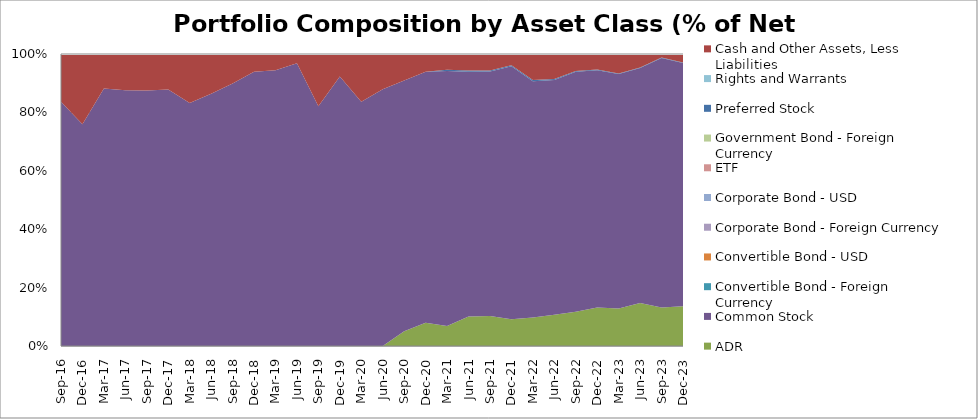
| Category | ADR | Common Stock | Convertible Bond - Foreign Currency  | Convertible Bond - USD | Corporate Bond - Foreign Currency  | Corporate Bond - USD | ETF | Government Bond - Foreign Currency  | Preferred Stock | Rights and Warrants | Cash and Other Assets, Less Liabilities |
|---|---|---|---|---|---|---|---|---|---|---|---|
| 2016-09-30 | 0 | 83.66 | 0 | 0 | 0 | 0 | 0 | 0 | 0 | 0 | 16.34 |
| 2016-12-31 | 0 | 75.91 | 0 | 0 | 0 | 0 | 0 | 0 | 0 | 0 | 24.09 |
| 2017-03-31 | 0 | 88.198 | 0 | 0 | 0 | 0 | 0 | 0 | 0 | 0 | 11.79 |
| 2017-06-30 | 0 | 87.565 | 0 | 0 | 0 | 0 | 0 | 0 | 0 | 0 | 12.434 |
| 2017-09-30 | 0 | 87.49 | 0 | 0 | 0 | 0 | 0 | 0 | 0 | 0 | 12.51 |
| 2017-12-31 | 0 | 87.87 | 0 | 0 | 0 | 0 | 0 | 0 | 0 | 0 | 12.13 |
| 2018-03-31 | 0 | 83.25 | 0 | 0 | 0 | 0 | 0 | 0 | 0 | 0 | 16.75 |
| 2018-06-30 | 0 | 86.4 | 0 | 0 | 0 | 0 | 0 | 0 | 0 | 0 | 13.6 |
| 2018-09-30 | 0 | 89.92 | 0 | 0 | 0 | 0 | 0 | 0 | 0 | 0 | 10.08 |
| 2018-12-31 | 0 | 93.96 | 0 | 0 | 0 | 0 | 0 | 0 | 0 | 0 | 6.04 |
| 2019-03-31 | 0 | 94.4 | 0 | 0 | 0 | 0 | 0 | 0 | 0 | 0 | 5.6 |
| 2019-06-30 | 0 | 96.82 | 0 | 0 | 0 | 0 | 0 | 0 | 0 | 0 | 3.18 |
| 2019-09-30 | 0 | 82.13 | 0 | 0 | 0 | 0 | 0 | 0 | 0 | 0 | 17.87 |
| 2019-12-31 | 0 | 92.32 | 0 | 0 | 0 | 0 | 0 | 0 | 0 | 0 | 7.68 |
| 2020-03-31 | 0 | 83.68 | 0 | 0 | 0 | 0 | 0 | 0 | 0 | 0 | 16.32 |
| 2020-06-30 | 0 | 87.91 | 0 | 0 | 0 | 0 | 0 | 0 | 0 | 0 | 12.09 |
| 2020-09-30 | 5.01 | 85.94 | 0 | 0 | 0 | 0 | 0 | 0 | 0 | 0 | 9.05 |
| 2020-12-31 | 7.97 | 85.99 | 0 | 0 | 0 | 0 | 0 | 0 | 0 | 0 | 6.04 |
| 2021-03-31 | 6.85 | 87.3 | 0 | 0 | 0 | 0 | 0 | 0 | 0.48 | 0 | 5.37 |
| 2021-06-30 | 10.09 | 83.83 | 0 | 0 | 0 | 0 | 0 | 0 | 0.41 | 0 | 5.67 |
| 2021-09-30 | 10.28 | 83.7 | 0 | 0 | 0 | 0 | 0 | 0 | 0.34 | 0 | 5.68 |
| 2021-12-31 | 9.13 | 86.66 | 0 | 0 | 0 | 0 | 0 | 0 | 0.34 | 0 | 3.87 |
| 2022-03-31 | 9.75 | 80.95 | 0 | 0 | 0 | 0 | 0 | 0 | 0.38 | 0 | 8.92 |
| 2022-06-30 | 10.74 | 80.35 | 0 | 0 | 0 | 0 | 0 | 0 | 0.35 | 0 | 8.56 |
| 2022-09-30 | 11.76 | 82.19 | 0 | 0 | 0 | 0 | 0 | 0 | 0.24 | 0 | 5.81 |
| 2022-12-31 | 13.2 | 81.22 | 0 | 0 | 0 | 0 | 0 | 0 | 0.23 | 0 | 5.35 |
| 2023-03-31 | 12.85 | 80.33 | 0 | 0 | 0 | 0 | 0 | 0 | 0.17 | 0 | 6.65 |
| 2023-06-30 | 14.73 | 80.47 | 0 | 0 | 0 | 0 | 0 | 0 | 0.15 | 0 | 4.65 |
| 2023-09-30 | 13.22 | 85.41 | 0 | 0 | 0 | 0 | 0 | 0 | 0.13 | 0 | 1.24 |
| 2023-12-31 | 13.63 | 83.31 | 0 | 0 | 0 | 0 | 0 | 0 | 0.14 | 0 | 2.92 |